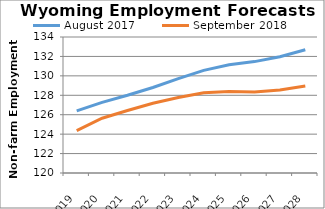
| Category | August 2017 | September 2018 |
|---|---|---|
| 2019.0 | 126.392 | 124.368 |
| 2020.0 | 127.268 | 125.639 |
| 2021.0 | 127.998 | 126.434 |
| 2022.0 | 128.805 | 127.18 |
| 2023.0 | 129.711 | 127.781 |
| 2024.0 | 130.563 | 128.27 |
| 2025.0 | 131.152 | 128.377 |
| 2026.0 | 131.466 | 128.326 |
| 2027.0 | 131.974 | 128.542 |
| 2028.0 | 132.693 | 128.946 |